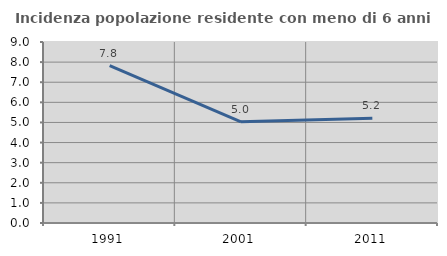
| Category | Incidenza popolazione residente con meno di 6 anni |
|---|---|
| 1991.0 | 7.827 |
| 2001.0 | 5.029 |
| 2011.0 | 5.207 |